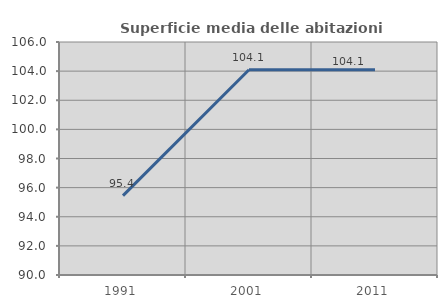
| Category | Superficie media delle abitazioni occupate |
|---|---|
| 1991.0 | 95.449 |
| 2001.0 | 104.097 |
| 2011.0 | 104.089 |